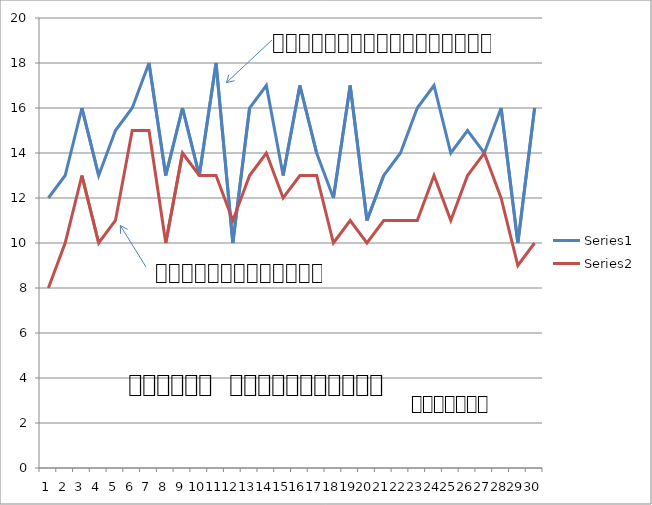
| Category | Series 0 | Series 1 |
|---|---|---|
| 0 | 12 | 8 |
| 1 | 13 | 10 |
| 2 | 16 | 13 |
| 3 | 13 | 10 |
| 4 | 15 | 11 |
| 5 | 16 | 15 |
| 6 | 18 | 15 |
| 7 | 13 | 10 |
| 8 | 16 | 14 |
| 9 | 13 | 13 |
| 10 | 18 | 13 |
| 11 | 10 | 11 |
| 12 | 16 | 13 |
| 13 | 17 | 14 |
| 14 | 13 | 12 |
| 15 | 17 | 13 |
| 16 | 14 | 13 |
| 17 | 12 | 10 |
| 18 | 17 | 11 |
| 19 | 11 | 10 |
| 20 | 13 | 11 |
| 21 | 14 | 11 |
| 22 | 16 | 11 |
| 23 | 17 | 13 |
| 24 | 14 | 11 |
| 25 | 15 | 13 |
| 26 | 14 | 14 |
| 27 | 16 | 12 |
| 28 | 10 | 9 |
| 29 | 16 | 10 |